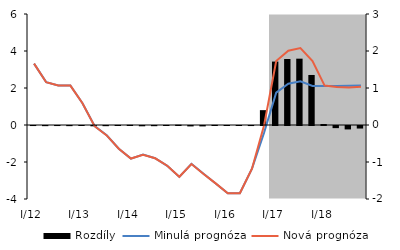
| Category | Rozdíly |
|---|---|
| 0 | -0.001 |
| 1 | -0.004 |
| 2 | -0.001 |
| 3 | -0.004 |
| 4 | -0.001 |
| 5 | -0.008 |
| 6 | -0.005 |
| 7 | 0.002 |
| 8 | 0.005 |
| 9 | -0.008 |
| 10 | -0.005 |
| 11 | 0.001 |
| 12 | 0.007 |
| 13 | -0.011 |
| 14 | -0.011 |
| 15 | 0.003 |
| 16 | 0 |
| 17 | 0 |
| 18 | -0.001 |
| 19 | 0.401 |
| 20 | 1.714 |
| 21 | 1.783 |
| 22 | 1.793 |
| 23 | 1.352 |
| 24 | 0.026 |
| 25 | -0.058 |
| 26 | -0.092 |
| 27 | -0.068 |